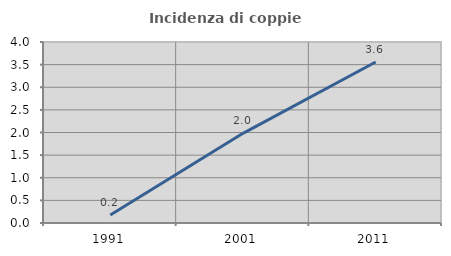
| Category | Incidenza di coppie miste |
|---|---|
| 1991.0 | 0.176 |
| 2001.0 | 1.982 |
| 2011.0 | 3.557 |